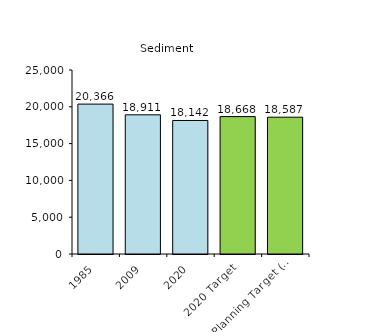
| Category | Series 0 |
|---|---|
| 1985 | 20365.936 |
| 2009 | 18910.756 |
| 2020 | 18142.144 |
| 2020 Target | 18667.958 |
| 2025 Planning Target (amt. allowed in Bay)  | 18587.026 |